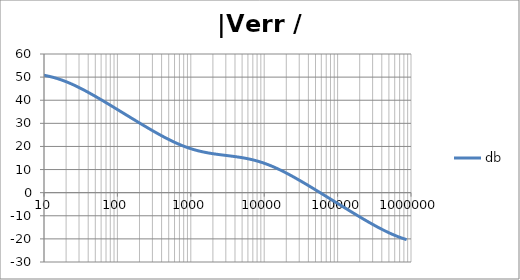
| Category | db |
|---|---|
| 1.0 | 52.325 |
| 1.0715193052376064 | 52.322 |
| 1.1481536214968828 | 52.319 |
| 1.2302687708123814 | 52.315 |
| 1.318256738556407 | 52.311 |
| 1.4125375446227544 | 52.306 |
| 1.513561248436208 | 52.301 |
| 1.6218100973589298 | 52.295 |
| 1.7378008287493754 | 52.288 |
| 1.8620871366628673 | 52.279 |
| 1.9952623149688797 | 52.27 |
| 2.1379620895022318 | 52.259 |
| 2.2908676527677727 | 52.247 |
| 2.45470891568503 | 52.233 |
| 2.6302679918953817 | 52.217 |
| 2.8183829312644537 | 52.198 |
| 3.0199517204020156 | 52.177 |
| 3.235936569296282 | 52.153 |
| 3.467368504525316 | 52.126 |
| 3.7153522909717256 | 52.095 |
| 3.9810717055349727 | 52.059 |
| 4.265795188015926 | 52.018 |
| 4.570881896148749 | 51.972 |
| 4.897788193684462 | 51.92 |
| 5.2480746024977245 | 51.86 |
| 5.62341325190349 | 51.793 |
| 6.025595860743575 | 51.717 |
| 6.456542290346554 | 51.632 |
| 6.918309709189363 | 51.535 |
| 7.4131024130091765 | 51.428 |
| 7.943282347242814 | 51.307 |
| 8.511380382023765 | 51.173 |
| 9.120108393559095 | 51.023 |
| 9.772372209558105 | 50.858 |
| 10.47128548050899 | 50.675 |
| 11.22018454301963 | 50.475 |
| 12.022644346174127 | 50.255 |
| 12.88249551693134 | 50.016 |
| 13.803842646028851 | 49.757 |
| 14.791083881682074 | 49.478 |
| 15.848931924611136 | 49.178 |
| 16.98243652461744 | 48.857 |
| 18.197008586099834 | 48.516 |
| 19.498445997580447 | 48.155 |
| 20.892961308540382 | 47.774 |
| 22.387211385683386 | 47.374 |
| 23.988329190194897 | 46.957 |
| 25.703957827688622 | 46.522 |
| 27.54228703338165 | 46.072 |
| 29.51209226666385 | 45.606 |
| 31.62277660168379 | 45.127 |
| 33.884415613920254 | 44.636 |
| 36.307805477010106 | 44.132 |
| 38.90451449942804 | 43.618 |
| 41.686938347033525 | 43.095 |
| 44.6683592150963 | 42.563 |
| 47.86300923226381 | 42.024 |
| 51.28613839913647 | 41.478 |
| 54.95408738576247 | 40.925 |
| 58.88436553555889 | 40.368 |
| 63.09573444801931 | 39.806 |
| 67.60829753919813 | 39.239 |
| 72.44359600749901 | 38.67 |
| 77.62471166286915 | 38.097 |
| 83.17637711026705 | 37.522 |
| 89.12509381337456 | 36.945 |
| 95.49925860214357 | 36.366 |
| 102.32929922807544 | 35.786 |
| 109.64781961431841 | 35.205 |
| 117.48975549395293 | 34.623 |
| 125.89254117941665 | 34.041 |
| 134.89628825916537 | 33.46 |
| 144.54397707459273 | 32.878 |
| 154.88166189124806 | 32.298 |
| 165.95869074375608 | 31.718 |
| 177.82794100389225 | 31.14 |
| 190.5460717963248 | 30.564 |
| 204.17379446695278 | 29.99 |
| 218.77616239495524 | 29.419 |
| 234.42288153199212 | 28.851 |
| 251.18864315095806 | 28.287 |
| 269.15348039269156 | 27.727 |
| 288.4031503126605 | 27.173 |
| 309.0295432513591 | 26.624 |
| 331.1311214825911 | 26.081 |
| 354.81338923357566 | 25.545 |
| 380.18939632056095 | 25.018 |
| 407.3802778041123 | 24.499 |
| 436.5158322401654 | 23.991 |
| 467.7351412871979 | 23.493 |
| 501.18723362727184 | 23.008 |
| 537.0317963702526 | 22.535 |
| 575.4399373371566 | 22.077 |
| 616.5950018614822 | 21.634 |
| 660.6934480075952 | 21.208 |
| 707.9457843841375 | 20.798 |
| 758.5775750291831 | 20.407 |
| 812.8305161640983 | 20.034 |
| 870.9635899560801 | 19.68 |
| 933.2543007969903 | 19.346 |
| 999.9999999999998 | 19.032 |
| 1071.5193052376057 | 18.738 |
| 1148.1536214968828 | 18.463 |
| 1230.2687708123801 | 18.206 |
| 1318.2567385564053 | 17.969 |
| 1412.537544622753 | 17.748 |
| 1513.5612484362066 | 17.544 |
| 1621.8100973589292 | 17.356 |
| 1737.8008287493742 | 17.181 |
| 1862.0871366628671 | 17.019 |
| 1995.2623149688786 | 16.868 |
| 2137.9620895022326 | 16.726 |
| 2290.867652767771 | 16.593 |
| 2454.708915685027 | 16.465 |
| 2630.26799189538 | 16.343 |
| 2818.382931264451 | 16.224 |
| 3019.9517204020176 | 16.106 |
| 3235.9365692962774 | 15.988 |
| 3467.368504525316 | 15.869 |
| 3715.352290971724 | 15.746 |
| 3981.07170553497 | 15.618 |
| 4265.795188015923 | 15.484 |
| 4570.881896148745 | 15.341 |
| 4897.788193684463 | 15.189 |
| 5248.074602497726 | 15.025 |
| 5623.413251903489 | 14.849 |
| 6025.595860743574 | 14.659 |
| 6456.54229034655 | 14.453 |
| 6918.309709189357 | 14.231 |
| 7413.102413009165 | 13.991 |
| 7943.282347242815 | 13.733 |
| 8511.380382023763 | 13.456 |
| 9120.108393559092 | 13.159 |
| 9772.3722095581 | 12.843 |
| 10471.285480509003 | 12.506 |
| 11220.184543019639 | 12.151 |
| 12022.64434617411 | 11.776 |
| 12882.495516931338 | 11.382 |
| 13803.842646028841 | 10.97 |
| 14791.083881682063 | 10.542 |
| 15848.931924611119 | 10.097 |
| 16982.436524617453 | 9.637 |
| 18197.008586099837 | 9.163 |
| 19498.445997580417 | 8.676 |
| 20892.961308540387 | 8.177 |
| 22387.211385683382 | 7.666 |
| 23988.32919019488 | 7.147 |
| 25703.957827688606 | 6.618 |
| 27542.28703338167 | 6.081 |
| 29512.092266663854 | 5.536 |
| 31622.77660168378 | 4.986 |
| 33884.41561392023 | 4.43 |
| 36307.805477010166 | 3.868 |
| 38904.514499428085 | 3.302 |
| 41686.93834703348 | 2.733 |
| 44668.35921509631 | 2.16 |
| 47863.00923226382 | 1.584 |
| 51286.13839913646 | 1.005 |
| 54954.08738576241 | 0.425 |
| 58884.365535558936 | -0.158 |
| 63095.73444801934 | -0.741 |
| 67608.29753919817 | -1.326 |
| 72443.59600749899 | -1.912 |
| 77624.71166286913 | -2.499 |
| 83176.37711026703 | -3.086 |
| 89125.09381337445 | -3.673 |
| 95499.25860214363 | -4.26 |
| 102329.29922807543 | -4.847 |
| 109647.81961431848 | -5.433 |
| 117489.75549395289 | -6.019 |
| 125892.54117941685 | -6.603 |
| 134896.28825916522 | -7.186 |
| 144543.97707459255 | -7.768 |
| 154881.66189124787 | -8.347 |
| 165958.69074375575 | -8.924 |
| 177827.9410038922 | -9.499 |
| 190546.07179632425 | -10.07 |
| 204173.79446695274 | -10.637 |
| 218776.16239495497 | -11.201 |
| 234422.88153199226 | -11.759 |
| 251188.64315095753 | -12.312 |
| 269153.480392691 | -12.859 |
| 288403.15031266044 | -13.4 |
| 309029.5432513582 | -13.932 |
| 331131.1214825907 | -14.456 |
| 354813.3892335749 | -14.97 |
| 380189.3963205612 | -15.474 |
| 407380.2778041119 | -15.966 |
| 436515.8322401649 | -16.446 |
| 467735.14128719777 | -16.911 |
| 501187.2336272717 | -17.362 |
| 537031.7963702519 | -17.797 |
| 575439.9373371559 | -18.214 |
| 616595.001861482 | -18.614 |
| 660693.4480075944 | -18.995 |
| 707945.7843841374 | -19.357 |
| 758577.575029183 | -19.698 |
| 812830.5161640996 | -20.019 |
| 870963.5899560791 | -20.319 |